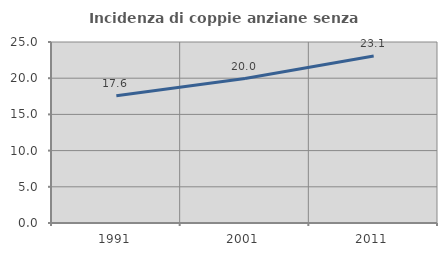
| Category | Incidenza di coppie anziane senza figli  |
|---|---|
| 1991.0 | 17.578 |
| 2001.0 | 19.957 |
| 2011.0 | 23.059 |